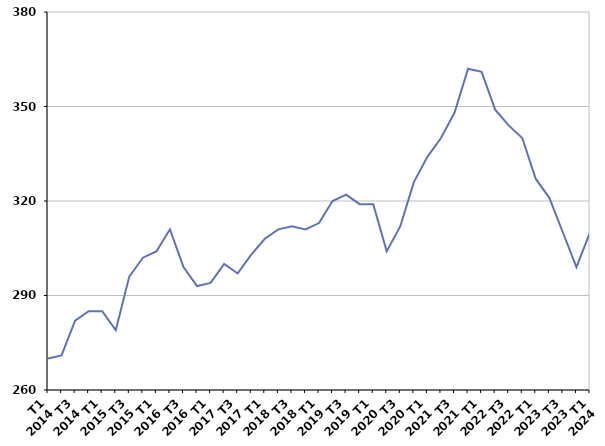
| Category | Durée moyenne d'inscription sur les listes des sortants |
|---|---|
| T1
2014 | 270 |
| T2
2014 | 271 |
| T3
2014 | 282 |
| T4
2014 | 285 |
| T1
2015 | 285 |
| T2
2015 | 279 |
| T3
2015 | 296 |
| T4
2015 | 302 |
| T1
2016 | 304 |
| T2
2016 | 311 |
| T3
2016 | 299 |
| T4
2016 | 293 |
| T1
2017 | 294 |
| T2
2017 | 300 |
| T3
2017 | 297 |
| T4
2017 | 303 |
| T1
2018 | 308 |
| T2
2018 | 311 |
| T3
2018 | 312 |
| T4
2018 | 311 |
| T1
2019 | 313 |
| T2
2019 | 320 |
| T3
2019 | 322 |
| T4
2019 | 319 |
| T1
2020 | 319 |
| T2
2020 | 304 |
| T3
2020 | 312 |
| T4
2020 | 326 |
| T1
2021 | 334 |
| T2
2021 | 340 |
| T3
2021 | 348 |
| T4
2021 | 362 |
| T1
2022 | 361 |
| T2
2022 | 349 |
| T3
2022 | 344 |
| T4
2022 | 340 |
| T1
2023 | 327 |
| T2
2023 | 321 |
| T3
2023 | 310 |
| T4
2023 | 299 |
| T1
2024 | 310 |